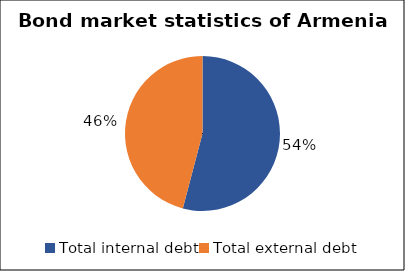
| Category | Bond market statistics of Armenia |
|---|---|
| Total internal debt | 2.769 |
| Total external debt | 2.35 |